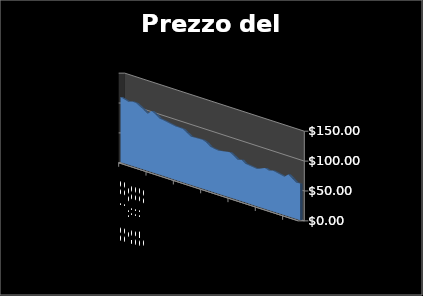
| Category | Prezzo di chiusura |
|---|---|
| 2008-09-22 | 108.59 |
| 2008-09-23 | 106.95 |
| 2008-09-24 | 105.15 |
| 2008-09-25 | 107.5 |
| 2008-09-26 | 107 |
| 2008-09-29 | 95.65 |
| 2008-09-30 | 102.25 |
| 2008-10-01 | 98.56 |
| 2008-10-02 | 93.87 |
| 2008-10-03 | 92.87 |
| 2008-10-06 | 89.26 |
| 2008-10-07 | 89.3 |
| 2008-10-08 | 88.76 |
| 2008-10-09 | 84.71 |
| 2008-10-10 | 80.69 |
| 2008-10-13 | 81.35 |
| 2008-10-14 | 79.2 |
| 2008-10-15 | 73.88 |
| 2008-10-16 | 72.76 |
| 2008-10-17 | 72.05 |
| 2008-10-20 | 75.26 |
| 2008-10-21 | 71.53 |
| 2008-10-22 | 67.11 |
| 2008-10-23 | 69.37 |
| 2008-10-24 | 64.69 |
| 2008-10-27 | 62.18 |
| 2008-10-28 | 64.91 |
| 2008-10-29 | 68.22 |
| 2008-10-30 | 65.84 |
| 2008-10-31 | 68.07 |
| 2008-11-03 | 64.08 |
| 2008-11-04 | 70.03 |
| 2008-11-05 | 65.41 |
| 2008-11-06 | 60.84 |
| 2008-11-07 | 61.06 |